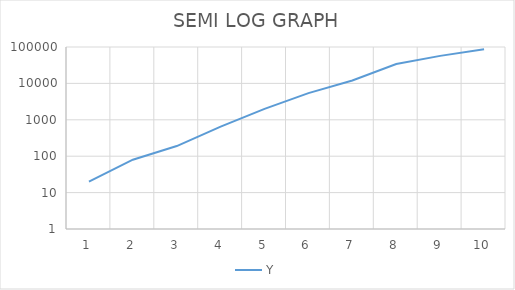
| Category | Y |
|---|---|
| 1.0 | 20 |
| 2.0 | 80 |
| 3.0 | 190 |
| 4.0 | 650 |
| 5.0 | 2000 |
| 6.0 | 5400 |
| 7.0 | 12000 |
| 8.0 | 34000 |
| 9.0 | 57000 |
| 10.0 | 87000 |